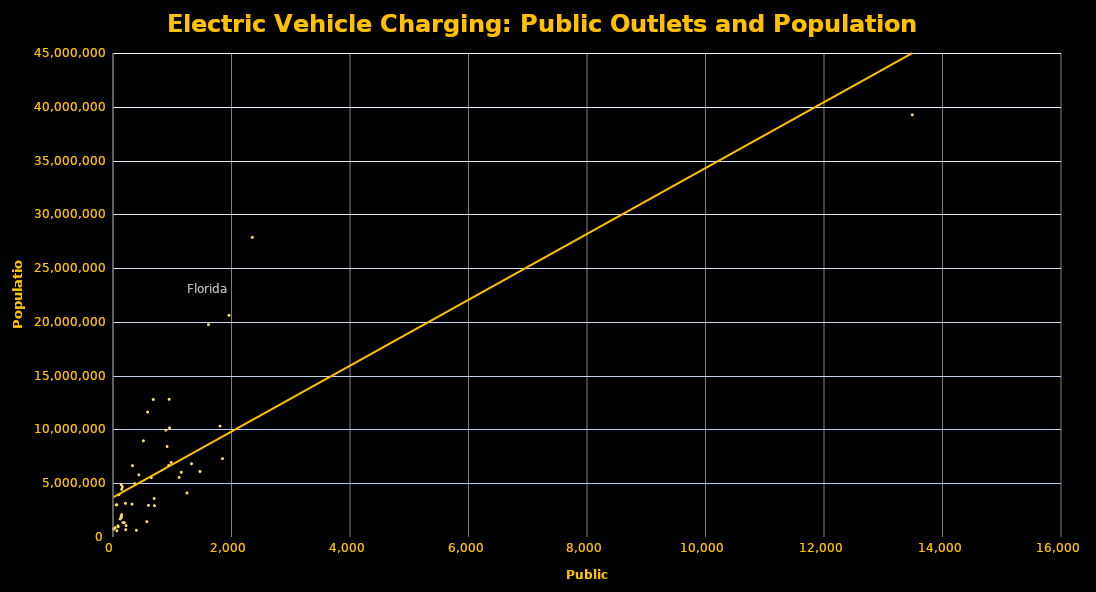
| Category | Population |
|---|---|
| 139.0 | 4863300 |
| 9.0 | 741894 |
| 982.0 | 6931071 |
| 65.0 | 2988248 |
| 13490.0 | 39250017 |
| 1116.0 | 5540545 |
| 695.0 | 3576452 |
| 89.0 | 952065 |
| 215.0 | 681170 |
| 1958.0 | 20612439 |
| 1806.0 | 10310371 |
| 571.0 | 1428557 |
| 120.0 | 1683140 |
| 947.0 | 12801539 |
| 328.0 | 6633053 |
| 210.0 | 3134693 |
| 700.0 | 2907289 |
| 147.0 | 4436974 |
| 158.0 | 4681666 |
| 189.0 | 1331479 |
| 1152.0 | 6016447 |
| 1325.0 | 6811779 |
| 892.0 | 9928300 |
| 647.0 | 5519952 |
| 54.0 | 2988726 |
| 1468.0 | 6093000 |
| 82.0 | 1042520 |
| 136.0 | 1907116 |
| 598.0 | 2940058 |
| 168.0 | 1334795 |
| 513.0 | 8944469 |
| 147.0 | 2081015 |
| 1611.0 | 19745289 |
| 954.0 | 10146788 |
| 11.0 | 757952 |
| 584.0 | 11614373 |
| 100.0 | 3923561 |
| 1249.0 | 4093465 |
| 679.0 | 12784227 |
| 220.0 | 1056426 |
| 368.0 | 4961119 |
| 36.0 | 865454 |
| 941.0 | 6651194 |
| 2351.0 | 27862596 |
| 320.0 | 3051217 |
| 395.0 | 624594 |
| 913.0 | 8411808 |
| 1848.0 | 7288000 |
| 143.0 | 1831102 |
| 436.0 | 5778708 |
| 64.0 | 585501 |